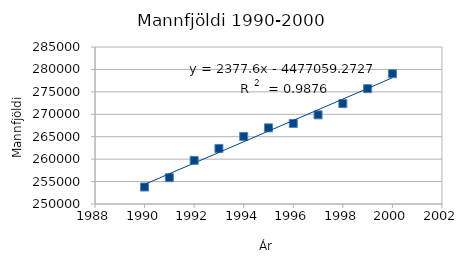
| Category | Mannfjöldi 1. janúar |
|---|---|
| 1990.0 | 253785 |
| 1991.0 | 255866 |
| 1992.0 | 259727 |
| 1993.0 | 262386 |
| 1994.0 | 265064 |
| 1995.0 | 266978 |
| 1996.0 | 267958 |
| 1997.0 | 269874 |
| 1998.0 | 272381 |
| 1999.0 | 275712 |
| 2000.0 | 279049 |